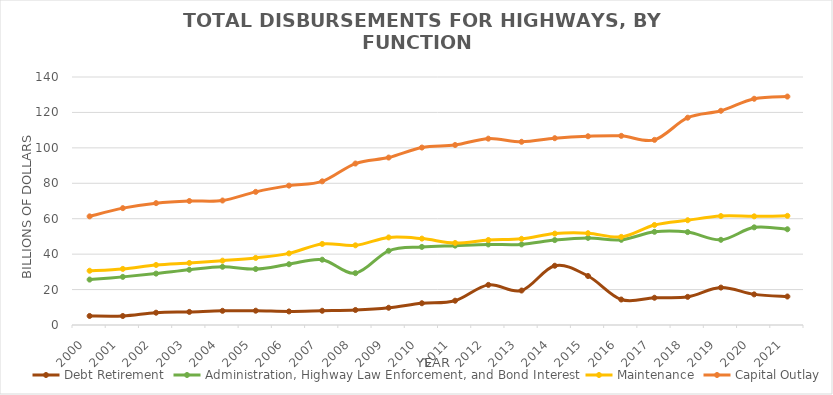
| Category | Debt Retirement | Administration, Highway Law Enforcement, and Bond Interest | Maintenance | Capital Outlay |
|---|---|---|---|---|
| 2000.0 | 5.105 | 25.634 | 30.636 | 61.323 |
| 2001.0 | 5.086 | 27.17 | 31.677 | 65.968 |
| 2002.0 | 6.945 | 29.008 | 33.893 | 68.794 |
| 2003.0 | 7.393 | 31.198 | 35.011 | 70.004 |
| 2004.0 | 8.011 | 32.878 | 36.327 | 70.274 |
| 2005.0 | 8.071 | 31.584 | 37.882 | 75.162 |
| 2006.0 | 7.648 | 34.311 | 40.426 | 78.676 |
| 2007.0 | 8.032 | 36.864 | 45.759 | 81.098 |
| 2008.0 | 8.477 | 29.276 | 44.972 | 91.144 |
| 2009.0 | 9.734 | 41.887 | 49.432 | 94.525 |
| 2010.0 | 12.279 | 44.087 | 48.773 | 100.175 |
| 2011.0 | 13.713 | 44.804 | 46.311 | 101.612 |
| 2012.0 | 22.649 | 45.481 | 47.99 | 105.199 |
| 2013.0 | 19.459 | 45.493 | 48.655 | 103.426 |
| 2014.0 | 33.453 | 47.93 | 51.593 | 105.452 |
| 2015.0 | 27.658 | 49.181 | 51.817 | 106.539 |
| 2016.0 | 14.384 | 48.088 | 49.749 | 106.78 |
| 2017.0 | 15.383 | 52.616 | 56.466 | 104.512 |
| 2018.0 | 15.89 | 52.445 | 59.139 | 117.025 |
| 2019.0 | 21.123 | 48.088 | 61.503 | 120.934 |
| 2020.0 | 17.287 | 55.132 | 61.346 | 127.716 |
| 2021.0 | 16.081 | 54.04 | 61.622 | 128.95 |